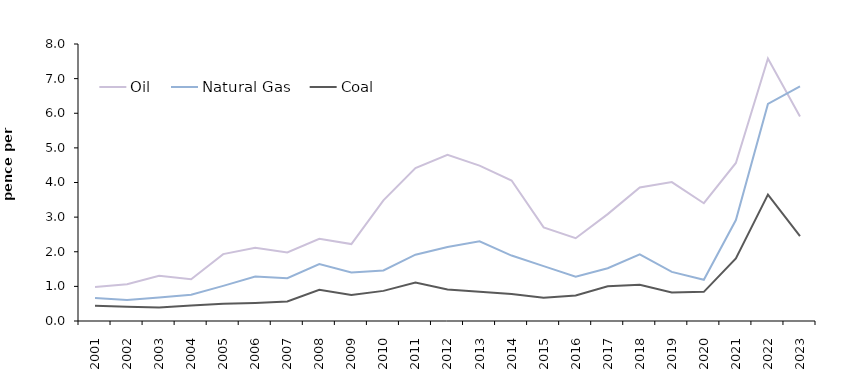
| Category | Oil | Natural Gas | Coal |
|---|---|---|---|
| 2001.0 | 0.982 | 0.664 | 0.444 |
| 2002.0 | 1.061 | 0.609 | 0.41 |
| 2003.0 | 1.309 | 0.682 | 0.39 |
| 2004.0 | 1.204 | 0.761 | 0.45 |
| 2005.0 | 1.932 | 1.015 | 0.497 |
| 2006.0 | 2.115 | 1.284 | 0.523 |
| 2007.0 | 1.982 | 1.236 | 0.565 |
| 2008.0 | 2.373 | 1.644 | 0.899 |
| 2009.0 | 2.223 | 1.403 | 0.752 |
| 2010.0 | 3.486 | 1.461 | 0.87 |
| 2011.0 | 4.417 | 1.914 | 1.108 |
| 2012.0 | 4.797 | 2.135 | 0.912 |
| 2013.0 | 4.489 | 2.299 | 0.842 |
| 2014.0 | 4.058 | 1.89 | 0.778 |
| 2015.0 | 2.705 | 1.586 | 0.67 |
| 2016.0 | 2.392 | 1.276 | 0.738 |
| 2017.0 | 3.086 | 1.524 | 1.005 |
| 2018.0 | 3.855 | 1.925 | 1.044 |
| 2019.0 | 4.011 | 1.42 | 0.826 |
| 2020.0 | 3.401 | 1.19 | 0.842 |
| 2021.0 | 4.563 | 2.916 | 1.809 |
| 2022.0 | 7.581 | 6.271 | 3.651 |
| 2023.0 | 5.906 | 6.778 | 2.453 |